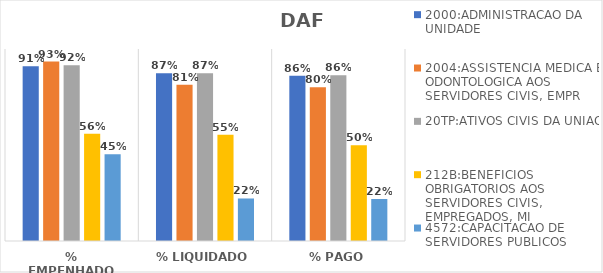
| Category | 2000:ADMINISTRACAO DA UNIDADE | 2004:ASSISTENCIA MEDICA E ODONTOLOGICA AOS SERVIDORES CIVIS, EMPR | 20TP:ATIVOS CIVIS DA UNIAO | 212B:BENEFICIOS OBRIGATORIOS AOS SERVIDORES CIVIS, EMPREGADOS, MI | 4572:CAPACITACAO DE SERVIDORES PUBLICOS FEDERAIS EM PROCESSO DE Q |
|---|---|---|---|---|---|
| % EMPENHADO | 0.91 | 0.935 | 0.915 | 0.558 | 0.452 |
| % LIQUIDADO | 0.874 | 0.814 | 0.873 | 0.554 | 0.221 |
| % PAGO | 0.861 | 0.801 | 0.864 | 0.498 | 0.219 |